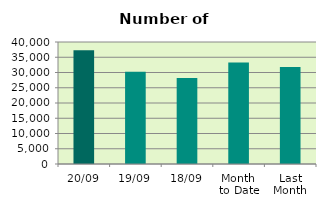
| Category | Series 0 |
|---|---|
| 20/09 | 37336 |
| 19/09 | 30282 |
| 18/09 | 28220 |
| Month 
to Date | 33286.533 |
| Last
Month | 31813.182 |